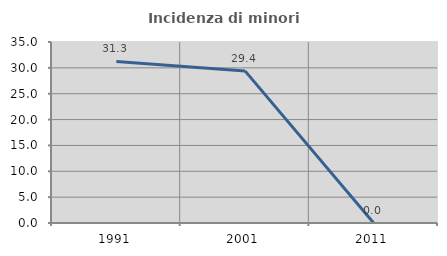
| Category | Incidenza di minori stranieri |
|---|---|
| 1991.0 | 31.25 |
| 2001.0 | 29.412 |
| 2011.0 | 0 |